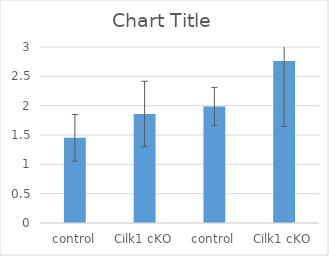
| Category | Series 0 |
|---|---|
| control | 1.452 |
| Cilk1 cKO | 1.858 |
| control | 1.988 |
| Cilk1 cKO | 2.763 |